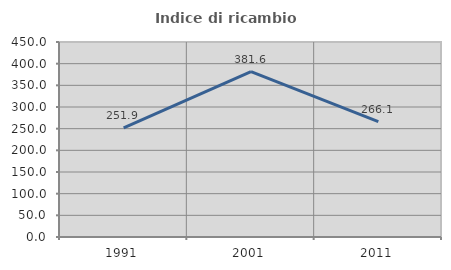
| Category | Indice di ricambio occupazionale  |
|---|---|
| 1991.0 | 251.923 |
| 2001.0 | 381.579 |
| 2011.0 | 266.129 |